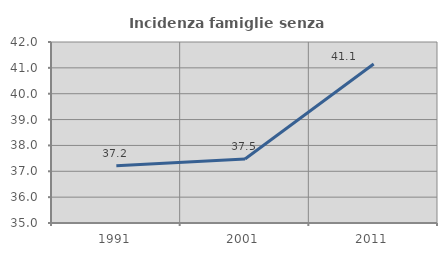
| Category | Incidenza famiglie senza nuclei |
|---|---|
| 1991.0 | 37.214 |
| 2001.0 | 37.473 |
| 2011.0 | 41.149 |